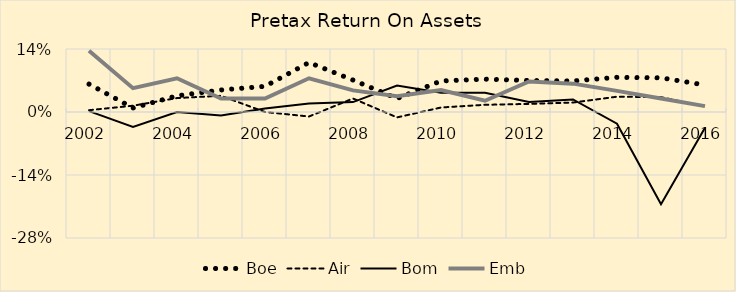
| Category | Boe | Air | Bom | Emb |
|---|---|---|---|---|
| 2002.0 | 0.062 | 0.004 | 0.002 | 0.136 |
| 2003.0 | 0.009 | 0.014 | -0.033 | 0.053 |
| 2004.0 | 0.036 | 0.031 | 0 | 0.075 |
| 2005.0 | 0.049 | 0.036 | -0.008 | 0.03 |
| 2006.0 | 0.057 | 0 | 0.008 | 0.03 |
| 2007.0 | 0.11 | -0.01 | 0.019 | 0.075 |
| 2008.0 | 0.071 | 0.03 | 0.022 | 0.048 |
| 2009.0 | 0.03 | -0.012 | 0.059 | 0.035 |
| 2010.0 | 0.069 | 0.01 | 0.043 | 0.049 |
| 2011.0 | 0.073 | 0.016 | 0.043 | 0.025 |
| 2012.0 | 0.07 | 0.018 | 0.022 | 0.068 |
| 2013.0 | 0.069 | 0.021 | 0.028 | 0.063 |
| 2014.0 | 0.077 | 0.034 | -0.026 | 0.047 |
| 2015.0 | 0.076 | 0.033 | -0.205 | 0.03 |
| 2016.0 | 0.06 | 0.012 | -0.035 | 0.013 |